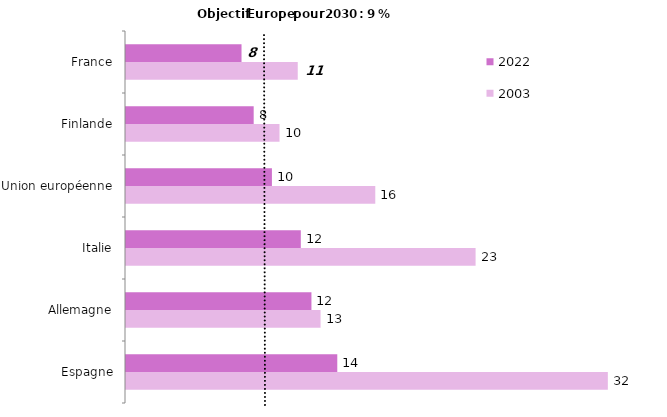
| Category | 2003 | 2022 |
|---|---|---|
| Espagne | 31.7 | 13.9 |
| Allemagne | 12.8 | 12.2 |
| Italie | 23 | 11.5 |
| Union européenne | 16.4 | 9.6 |
| Finlande | 10.1 | 8.4 |
| France | 11.3 | 7.6 |